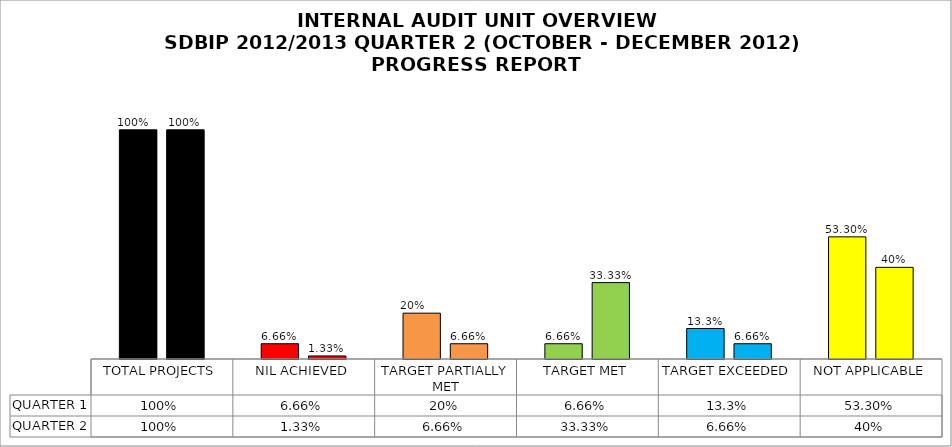
| Category | QUARTER 1 | QUARTER 2 |
|---|---|---|
| TOTAL PROJECTS | 1 | 1 |
| NIL ACHIEVED | 0.067 | 0.013 |
| TARGET PARTIALLY MET | 0.2 | 0.067 |
| TARGET MET | 0.067 | 0.333 |
| TARGET EXCEEDED | 0.133 | 0.067 |
| NOT APPLICABLE | 0.533 | 0.4 |